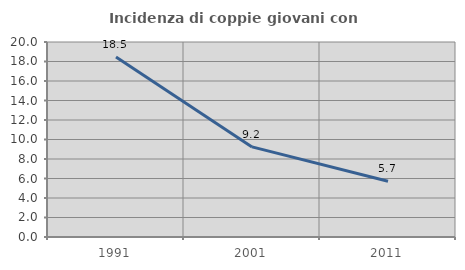
| Category | Incidenza di coppie giovani con figli |
|---|---|
| 1991.0 | 18.457 |
| 2001.0 | 9.239 |
| 2011.0 | 5.714 |